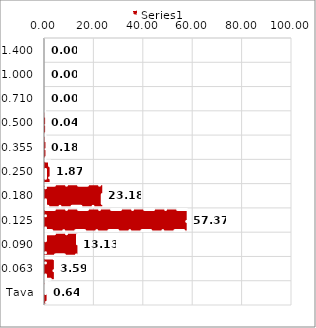
| Category | Series 0 |
|---|---|
| 1,400 | 0 |
| 1,000 | 0 |
| 0,710 | 0 |
| 0,500 | 0.04 |
| 0,355 | 0.18 |
| 0,250 | 1.87 |
| 0,180 | 23.18 |
| 0,125 | 57.37 |
| 0,090 | 13.13 |
| 0,063 | 3.59 |
| Tava | 0.64 |